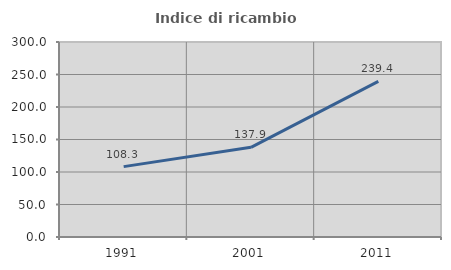
| Category | Indice di ricambio occupazionale  |
|---|---|
| 1991.0 | 108.274 |
| 2001.0 | 137.94 |
| 2011.0 | 239.412 |